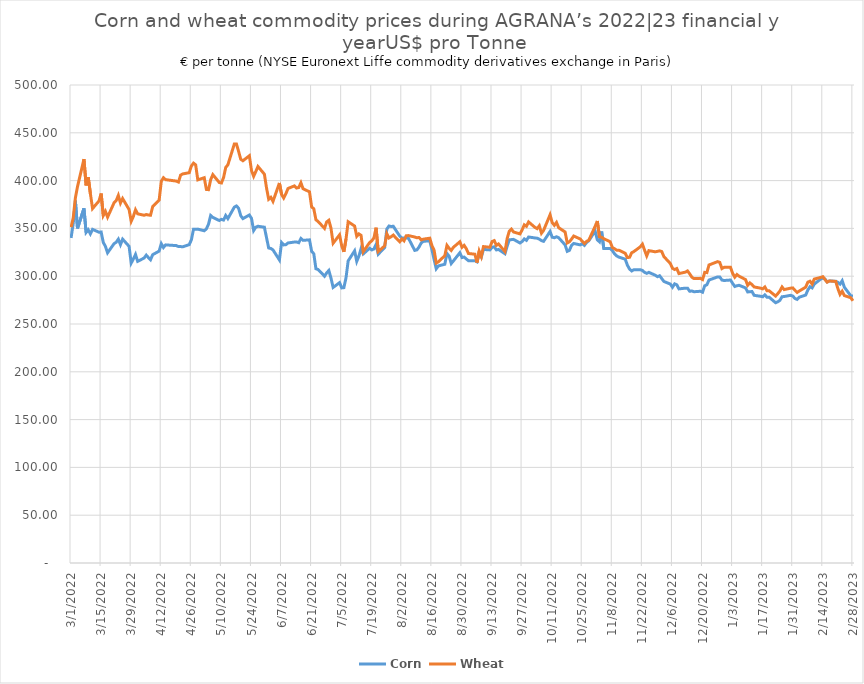
| Category | Corn | Wheat |
|---|---|---|
| 3/1/22 | 340 | 351.25 |
| 3/2/22 | 355 | 361 |
| 3/3/22 | 379 | 381.75 |
| 3/4/22 | 350 | 393.75 |
| 3/7/22 | 371 | 422.5 |
| 3/8/22 | 345.75 | 395 |
| 3/9/22 | 348.5 | 403.5 |
| 3/10/22 | 344.25 | 386.25 |
| 3/11/22 | 349 | 370.75 |
| 3/14/22 | 346 | 378.75 |
| 3/15/22 | 346.25 | 386.5 |
| 3/16/22 | 335.25 | 363.5 |
| 3/17/22 | 331.25 | 367.75 |
| 3/18/22 | 324.5 | 361.75 |
| 3/21/22 | 334 | 376.75 |
| 3/22/22 | 335.5 | 379 |
| 3/23/22 | 338.75 | 384.5 |
| 3/24/22 | 333 | 376.5 |
| 3/25/22 | 338.75 | 381.25 |
| 3/28/22 | 331.25 | 369.75 |
| 3/29/22 | 313.75 | 357.5 |
| 3/30/22 | 318 | 362.5 |
| 3/31/22 | 322.75 | 369.5 |
| 4/1/22 | 315.5 | 365.25 |
| 4/4/22 | 319 | 363.75 |
| 4/5/22 | 322 | 364.5 |
| 4/6/22 | 319.5 | 364 |
| 4/7/22 | 317.25 | 363.75 |
| 4/8/22 | 322.5 | 372.75 |
| 4/11/22 | 326.25 | 379.5 |
| 4/12/22 | 334 | 399.25 |
| 4/13/22 | 330 | 403 |
| 4/14/22 | 332.75 | 401 |
| 4/19/22 | 332 | 399.5 |
| 4/20/22 | 331 | 398.5 |
| 4/21/22 | 331 | 405.75 |
| 4/22/22 | 330.75 | 407 |
| 4/25/22 | 333 | 408.25 |
| 4/26/22 | 338 | 415.25 |
| 4/27/22 | 349 | 418.25 |
| 4/28/22 | 349 | 416.5 |
| 4/29/22 | 349.25 | 400.75 |
| 5/2/22 | 347.5 | 403 |
| 5/3/22 | 349.5 | 390.75 |
| 5/4/22 | 354.5 | 390.5 |
| 5/5/22 | 363.5 | 401 |
| 5/6/22 | 361.5 | 406.25 |
| 5/9/22 | 358.25 | 398 |
| 5/10/22 | 359.5 | 397.5 |
| 5/11/22 | 358.75 | 403.25 |
| 5/12/22 | 363.5 | 413.75 |
| 5/13/22 | 360.25 | 416.5 |
| 5/16/22 | 372.25 | 438.25 |
| 5/17/22 | 373.5 | 438.25 |
| 5/18/22 | 371 | 430.5 |
| 5/19/22 | 363.25 | 422.25 |
| 5/20/22 | 360.25 | 420.75 |
| 5/23/22 | 364 | 426 |
| 5/24/22 | 360.5 | 410.5 |
| 5/25/22 | 347.75 | 404.5 |
| 5/26/22 | 351.25 | 409.5 |
| 5/27/22 | 352.25 | 414.75 |
| 5/30/22 | 351.25 | 406.75 |
| 5/31/22 | 340.25 | 392.25 |
| 6/1/22 | 329.5 | 380.5 |
| 6/2/22 | 329 | 382.5 |
| 6/3/22 | 327.5 | 378.25 |
| 6/6/22 | 317 | 397.5 |
| 6/7/22 | 335.25 | 385.5 |
| 6/8/22 | 332.75 | 381.75 |
| 6/9/22 | 333 | 386.25 |
| 6/10/22 | 334.75 | 391.75 |
| 6/13/22 | 335.75 | 394.5 |
| 6/14/22 | 335.75 | 392.25 |
| 6/15/22 | 335 | 392.75 |
| 6/16/22 | 339.5 | 397.75 |
| 6/17/22 | 337.5 | 391.5 |
| 6/20/22 | 338 | 388.25 |
| 6/21/22 | 326 | 372.5 |
| 6/22/22 | 323.5 | 370.5 |
| 6/23/22 | 307.75 | 359 |
| 6/24/22 | 307 | 357.25 |
| 6/27/22 | 300 | 350 |
| 6/28/22 | 303.5 | 356.75 |
| 6/29/22 | 306 | 358.5 |
| 6/30/22 | 298 | 350.25 |
| 7/1/22 | 288.25 | 334.5 |
| 7/4/22 | 293.25 | 343.25 |
| 7/5/22 | 287.75 | 331.75 |
| 7/6/22 | 288 | 325.5 |
| 7/7/22 | 298.25 | 338.75 |
| 7/8/22 | 316 | 357 |
| 7/11/22 | 326.5 | 352.5 |
| 7/12/22 | 315.5 | 341.75 |
| 7/13/22 | 321 | 344.25 |
| 7/14/22 | 328.75 | 342.75 |
| 7/15/22 | 323.25 | 325.5 |
| 7/18/22 | 329.25 | 335.25 |
| 7/19/22 | 327.5 | 337 |
| 7/20/22 | 328.5 | 340 |
| 7/21/22 | 333.25 | 350.75 |
| 7/22/22 | 323 | 325.75 |
| 7/25/22 | 330 | 331.75 |
| 7/26/22 | 349.25 | 344.5 |
| 7/27/22 | 352.5 | 340 |
| 7/28/22 | 352 | 341.25 |
| 7/29/22 | 352.25 | 343 |
| 8/1/22 | 342 | 336 |
| 8/2/22 | 340 | 339 |
| 8/3/22 | 340 | 337 |
| 8/4/22 | 340 | 342.25 |
| 8/5/22 | 340 | 342.5 |
| 8/8/22 | 327 | 341 |
| 8/9/22 | 327.5 | 340.25 |
| 8/10/22 | 330.5 | 340.5 |
| 8/11/22 | 334.75 | 338 |
| 8/12/22 | 336.5 | 338.75 |
| 8/15/22 | 337 | 339.75 |
| 8/16/22 | 327.75 | 332 |
| 8/17/22 | 317.5 | 327.25 |
| 8/18/22 | 307.75 | 313.75 |
| 8/19/22 | 310.75 | 315 |
| 8/22/22 | 312.5 | 321.5 |
| 8/23/22 | 323.75 | 332.25 |
| 8/24/22 | 321 | 329.25 |
| 8/25/22 | 313.25 | 327 |
| 8/26/22 | 316 | 330.25 |
| 8/29/22 | 324.5 | 336 |
| 8/30/22 | 319.5 | 330.25 |
| 8/31/22 | 320 | 332.25 |
| 9/1/22 | 318 | 328.75 |
| 9/2/22 | 316.25 | 323.75 |
| 9/5/22 | 316.25 | 323 |
| 9/6/22 | 315 | 314.25 |
| 9/7/22 | 323.5 | 326.25 |
| 9/8/22 | 320 | 320.5 |
| 9/9/22 | 328 | 331 |
| 9/12/22 | 327.5 | 330.25 |
| 9/13/22 | 330.25 | 336.25 |
| 9/14/22 | 330.75 | 337.25 |
| 9/15/22 | 327.5 | 332.25 |
| 9/16/22 | 328 | 333.75 |
| 9/19/22 | 323.5 | 325.75 |
| 9/20/22 | 331.25 | 339.25 |
| 9/21/22 | 338 | 347 |
| 9/22/22 | 338.25 | 349.25 |
| 9/23/22 | 338.5 | 346.25 |
| 9/26/22 | 334.75 | 344.25 |
| 9/27/22 | 336.25 | 348.5 |
| 9/28/22 | 339 | 353.75 |
| 9/29/22 | 337.5 | 352.25 |
| 9/30/22 | 341 | 356.75 |
| 10/3/22 | 340 | 351 |
| 10/4/22 | 339.75 | 349.75 |
| 10/5/22 | 338.75 | 352.75 |
| 10/6/22 | 337.25 | 345 |
| 10/7/22 | 336.5 | 348 |
| 10/10/22 | 346.75 | 364.25 |
| 10/11/22 | 340.75 | 356 |
| 10/12/22 | 340.25 | 353.25 |
| 10/13/22 | 341.25 | 356.25 |
| 10/14/22 | 340.25 | 350.75 |
| 10/17/22 | 332.75 | 346.25 |
| 10/18/22 | 326 | 334.75 |
| 10/19/22 | 327 | 336 |
| 10/20/22 | 332.25 | 338.75 |
| 10/21/22 | 334.25 | 342 |
| 10/24/22 | 332.75 | 339 |
| 10/25/22 | 334 | 336.5 |
| 10/26/22 | 332.25 | 334.25 |
| 10/27/22 | 335.25 | 336.5 |
| 10/28/22 | 337 | 337.5 |
| 10/31/22 | 347.25 | 352.25 |
| 11/1/22 | 338 | 357.75 |
| 11/2/22 | 336 | 341.25 |
| 11/3/22 | 346.75 | 340.75 |
| 11/4/22 | 329 | 339.25 |
| 11/7/22 | 329 | 336 |
| 11/8/22 | 326.75 | 330 |
| 11/9/22 | 323.5 | 328.75 |
| 11/10/22 | 321.25 | 327.25 |
| 11/11/22 | 320 | 327.25 |
| 11/14/22 | 317.75 | 324 |
| 11/15/22 | 311.5 | 319.5 |
| 11/16/22 | 307.5 | 319.75 |
| 11/17/22 | 305.5 | 324.5 |
| 11/18/22 | 306.75 | 325.75 |
| 11/21/22 | 306.75 | 330.75 |
| 11/22/22 | 306 | 333.5 |
| 11/23/22 | 304 | 327.25 |
| 11/24/22 | 303 | 321.25 |
| 11/25/22 | 304 | 326.75 |
| 11/28/22 | 301 | 325.5 |
| 11/29/22 | 299.5 | 326 |
| 11/30/22 | 300.5 | 326.5 |
| 12/1/22 | 297.5 | 325.75 |
| 12/2/22 | 294.5 | 320.5 |
| 12/5/22 | 291.75 | 313.25 |
| 12/6/22 | 288.5 | 308.25 |
| 12/7/22 | 292 | 307 |
| 12/8/22 | 291 | 308 |
| 12/9/22 | 286.75 | 302.75 |
| 12/12/22 | 287.5 | 304.25 |
| 12/13/22 | 287.5 | 305.5 |
| 12/14/22 | 284.25 | 302.5 |
| 12/15/22 | 284.5 | 299 |
| 12/16/22 | 283.75 | 297.5 |
| 12/19/22 | 284.25 | 297.75 |
| 12/20/22 | 283.25 | 296.5 |
| 12/21/22 | 290 | 304 |
| 12/22/22 | 291 | 303.75 |
| 12/23/22 | 296 | 311.75 |
| 12/27/22 | 299.25 | 315.25 |
| 12/28/22 | 299.25 | 314.5 |
| 12/29/22 | 296 | 308 |
| 12/30/22 | 295.5 | 309.25 |
| 1/2/23 | 296 | 309.25 |
| 1/3/23 | 292.5 | 303 |
| 1/4/23 | 289.25 | 299 |
| 1/5/23 | 290 | 301.75 |
| 1/6/23 | 290.5 | 300 |
| 1/9/23 | 287.75 | 296.5 |
| 1/10/23 | 283.5 | 290.5 |
| 1/11/23 | 283.75 | 293 |
| 1/12/23 | 284 | 291.25 |
| 1/13/23 | 280 | 288.75 |
| 1/16/23 | 279 | 287.5 |
| 1/17/23 | 278.5 | 286.75 |
| 1/18/23 | 280.5 | 288.75 |
| 1/19/23 | 278 | 284.75 |
| 1/20/23 | 278 | 284.75 |
| 1/23/23 | 272.25 | 279.25 |
| 1/24/23 | 273.25 | 281.75 |
| 1/25/23 | 274.75 | 284.5 |
| 1/26/23 | 278.5 | 288.75 |
| 1/27/23 | 278.75 | 286 |
| 1/30/23 | 280 | 287.5 |
| 1/31/23 | 279.25 | 287.75 |
| 2/1/23 | 276.75 | 285.25 |
| 2/2/23 | 275.75 | 283 |
| 2/3/23 | 278 | 284.5 |
| 2/6/23 | 280.25 | 288.5 |
| 2/7/23 | 285.5 | 293.75 |
| 2/8/23 | 289 | 294.75 |
| 2/9/23 | 287.75 | 291.75 |
| 2/10/23 | 291.75 | 297 |
| 2/13/23 | 297 | 298.75 |
| 2/14/23 | 298 | 299.5 |
| 2/15/23 | 297 | 296.5 |
| 2/16/23 | 294 | 293.75 |
| 2/17/23 | 295 | 295 |
| 2/20/23 | 294.75 | 294.5 |
| 2/21/23 | 293.5 | 287 |
| 2/22/23 | 291.75 | 281 |
| 2/23/23 | 295.25 | 284.25 |
| 2/24/23 | 288.5 | 279.75 |
| 2/27/23 | 279.5 | 277.5 |
| 2/28/23 | 279.25 | 274.25 |